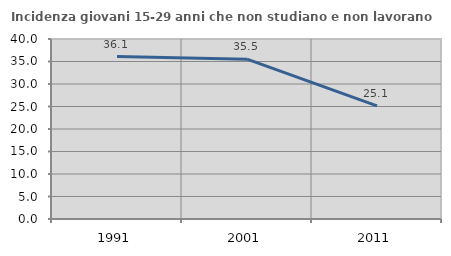
| Category | Incidenza giovani 15-29 anni che non studiano e non lavorano  |
|---|---|
| 1991.0 | 36.1 |
| 2001.0 | 35.513 |
| 2011.0 | 25.125 |